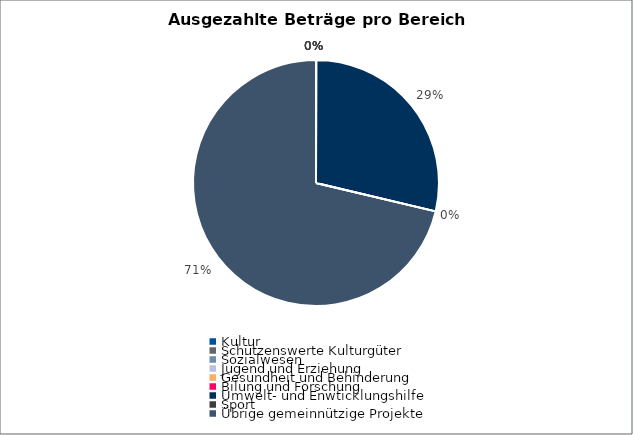
| Category | Series 0 |
|---|---|
| Kultur | 0 |
| Schützenswerte Kulturgüter | 0 |
| Sozialwesen | 0 |
| Jugend und Erziehung | 0 |
| Gesundheit und Behinderung | 0 |
| Bilung und Forschung | 0 |
| Umwelt- und Enwticklungshilfe | 175000 |
| Sport | 0 |
| Übrige gemeinnützige Projekte | 435000 |